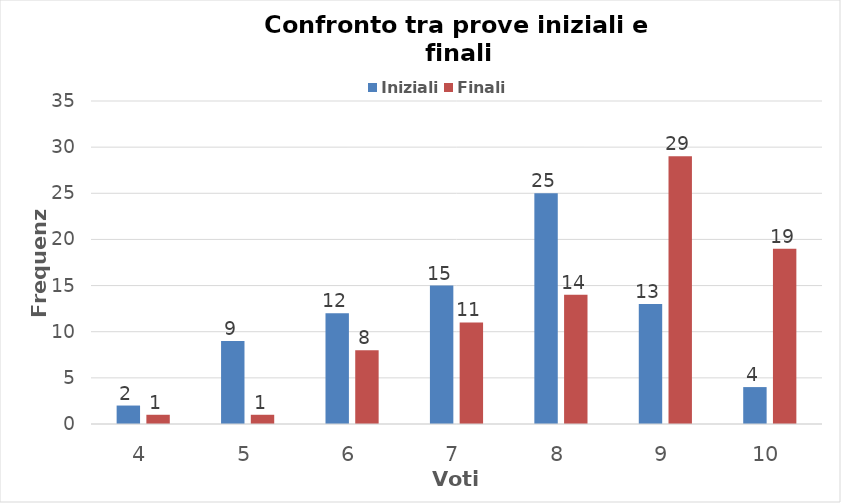
| Category | Iniziali | Finali |
|---|---|---|
| 4.0 | 2 | 1 |
| 5.0 | 9 | 1 |
| 6.0 | 12 | 8 |
| 7.0 | 15 | 11 |
| 8.0 | 25 | 14 |
| 9.0 | 13 | 29 |
| 10.0 | 4 | 19 |